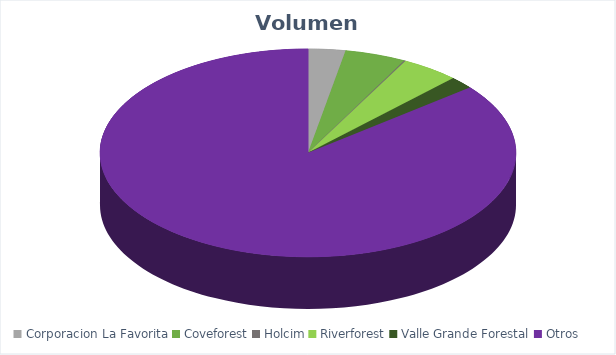
| Category | VOLUMEN ($USD) |
|---|---|
| Corporacion La Favorita | 9035.9 |
| Coveforest | 14859 |
| Holcim | 350 |
| Riverforest | 14108.7 |
| Valle Grande Forestal | 6000.8 |
| Otros | 268534 |